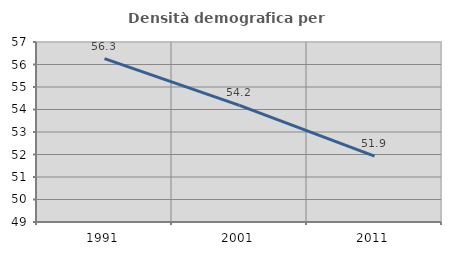
| Category | Densità demografica |
|---|---|
| 1991.0 | 56.262 |
| 2001.0 | 54.186 |
| 2011.0 | 51.93 |